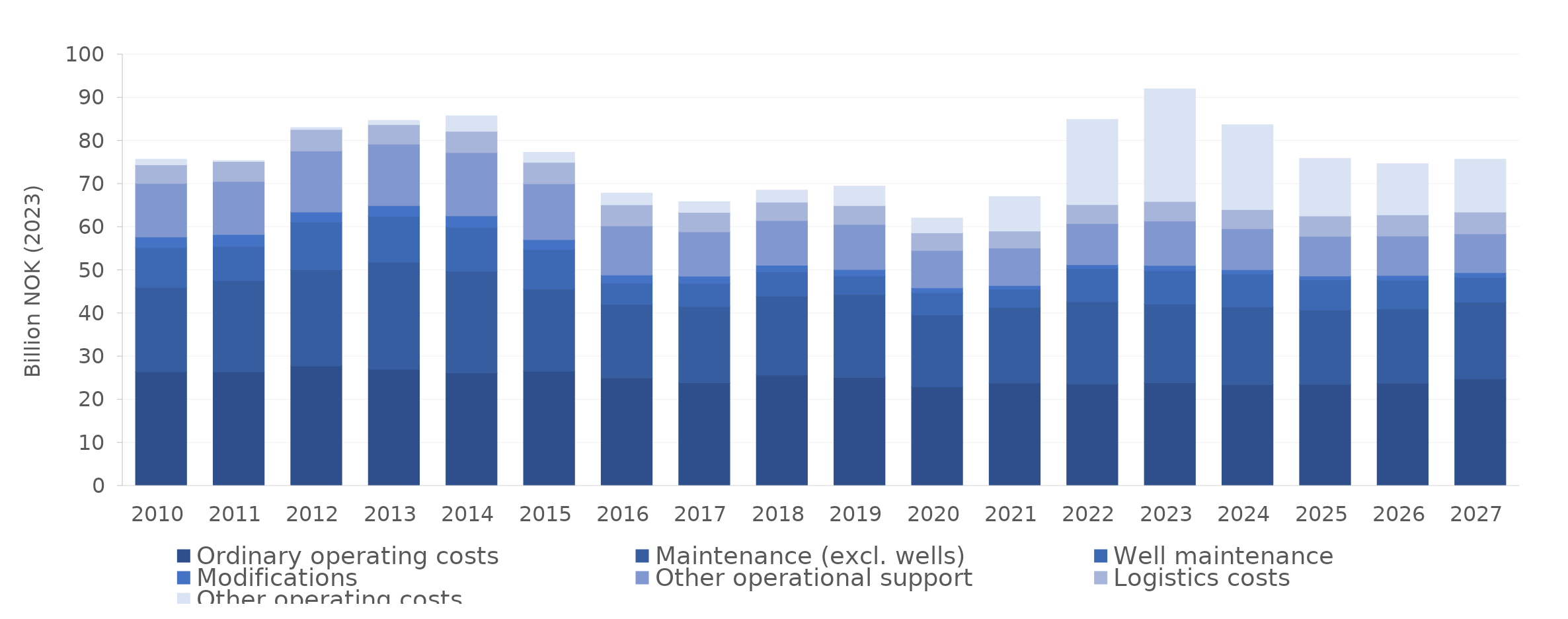
| Category | Ordinary operating costs | Maintenance (excl. wells) | Well maintenance | Modifications  | Other operational support  | Logistics costs | Other operating costs |
|---|---|---|---|---|---|---|---|
| 2010.0 | 26.407 | 19.569 | 9.235 | 2.493 | 12.414 | 4.292 | 1.325 |
| 2011.0 | 26.45 | 21.141 | 7.905 | 2.791 | 12.267 | 4.636 | 0.232 |
| 2012.0 | 27.796 | 22.266 | 11.09 | 2.311 | 14.182 | 4.983 | 0.45 |
| 2013.0 | 27.039 | 24.782 | 10.643 | 2.5 | 14.234 | 4.544 | 0.965 |
| 2014.0 | 26.175 | 23.607 | 10.187 | 2.614 | 14.679 | 4.924 | 3.596 |
| 2015.0 | 26.553 | 19.035 | 9.195 | 2.291 | 12.952 | 4.984 | 2.334 |
| 2016.0 | 25.002 | 17.087 | 4.944 | 1.852 | 11.369 | 4.897 | 2.744 |
| 2017.0 | 23.904 | 17.675 | 5.363 | 1.662 | 10.285 | 4.504 | 2.492 |
| 2018.0 | 25.696 | 18.279 | 5.63 | 1.544 | 10.318 | 4.321 | 2.79 |
| 2019.0 | 25.127 | 19.199 | 4.31 | 1.504 | 10.473 | 4.354 | 4.521 |
| 2020.0 | 22.944 | 16.682 | 5.124 | 1.153 | 8.662 | 4.085 | 3.441 |
| 2021.0 | 23.836 | 17.513 | 4.214 | 0.891 | 8.663 | 3.953 | 8.009 |
| 2022.0 | 23.639 | 18.997 | 7.751 | 0.883 | 9.508 | 4.435 | 19.739 |
| 2023.0 | 23.896 | 18.233 | 7.714 | 1.279 | 10.263 | 4.531 | 26.136 |
| 2024.0 | 23.473 | 17.995 | 7.631 | 1.018 | 9.485 | 4.448 | 19.683 |
| 2025.0 | 23.504 | 17.259 | 6.959 | 0.943 | 9.199 | 4.706 | 13.338 |
| 2026.0 | 23.788 | 17.207 | 6.717 | 1.058 | 9.14 | 4.901 | 11.893 |
| 2027.0 | 24.768 | 17.818 | 5.703 | 1.123 | 9.01 | 5.059 | 12.257 |